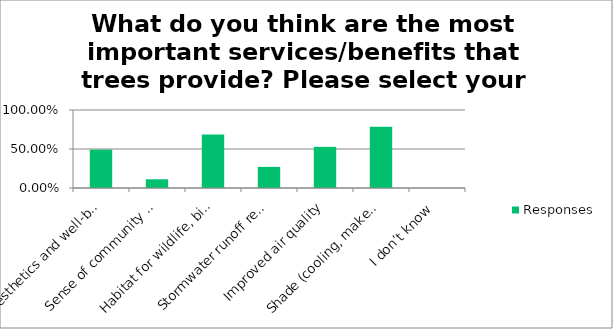
| Category | Responses |
|---|---|
| Aesthetics and well-being | 0.492 |
| Sense of community (increased property value and lower crime rates) | 0.112 |
| Habitat for wildlife, birds, and pollinators | 0.686 |
| Stormwater runoff reduction/ erosion control | 0.271 |
| Improved air quality | 0.528 |
| Shade (cooling, makes communities more walkable, and decreases energy consumption) | 0.784 |
| I don’t know | 0.002 |